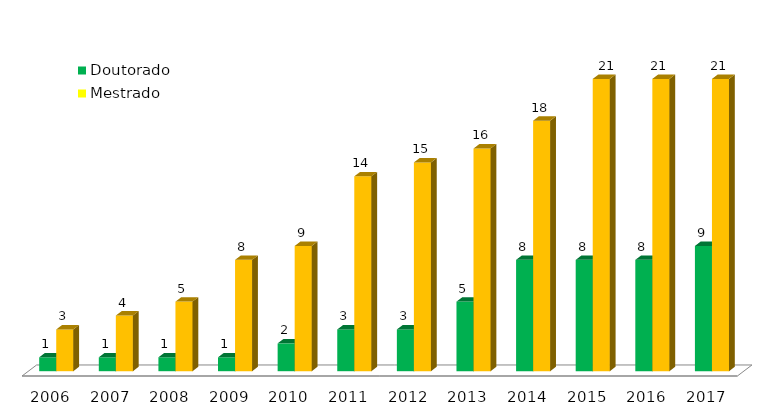
| Category | Doutorado | Mestrado |
|---|---|---|
| 2006.0 | 1 | 3 |
| 2007.0 | 1 | 4 |
| 2008.0 | 1 | 5 |
| 2009.0 | 1 | 8 |
| 2010.0 | 2 | 9 |
| 2011.0 | 3 | 14 |
| 2012.0 | 3 | 15 |
| 2013.0 | 5 | 16 |
| 2014.0 | 8 | 18 |
| 2015.0 | 8 | 21 |
| 2016.0 | 8 | 21 |
| 2017.0 | 9 | 21 |